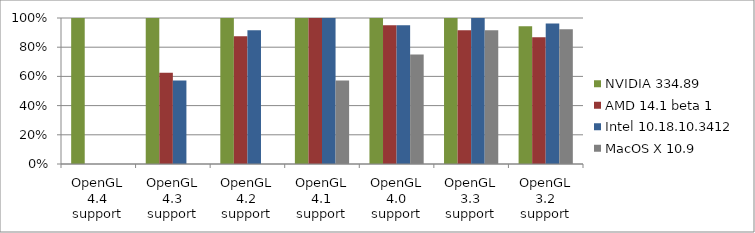
| Category | NVIDIA 334.89 | AMD 14.1 beta 1 | Intel 10.18.10.3412 | MacOS X 10.9 |
|---|---|---|---|---|
| OpenGL 4.4 support | 1 | 0 | 0 | 0 |
| OpenGL 4.3 support | 1 | 0.625 | 0.571 | 0 |
| OpenGL 4.2 support | 1 | 0.875 | 0.917 | 0 |
| OpenGL 4.1 support | 1 | 1 | 1 | 0.571 |
| OpenGL 4.0 support | 1 | 0.95 | 0.95 | 0.75 |
| OpenGL 3.3 support | 1 | 0.917 | 1 | 0.917 |
| OpenGL 3.2 support | 0.943 | 0.868 | 0.962 | 0.923 |